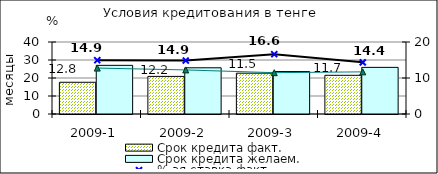
| Category | Срок кредита факт.  | Срок кредита желаем. |
|---|---|---|
| 2009-1 | 17.63 | 27.03 |
| 2009-2 | 20.89 | 25.67 |
| 2009-3 | 22.67 | 23.58 |
| 2009-4 | 21.5 | 25.91 |